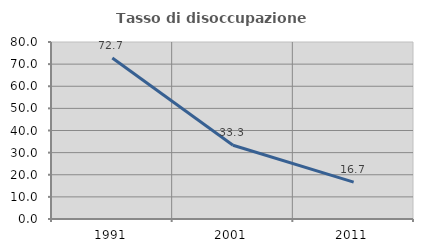
| Category | Tasso di disoccupazione giovanile  |
|---|---|
| 1991.0 | 72.727 |
| 2001.0 | 33.333 |
| 2011.0 | 16.667 |